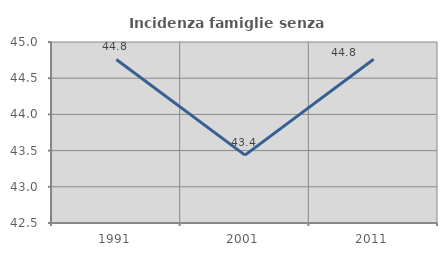
| Category | Incidenza famiglie senza nuclei |
|---|---|
| 1991.0 | 44.759 |
| 2001.0 | 43.438 |
| 2011.0 | 44.762 |